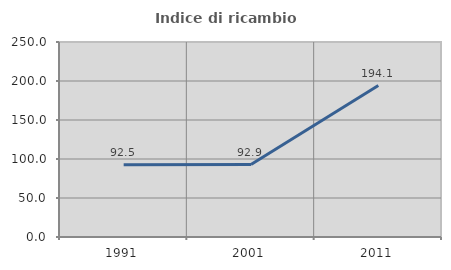
| Category | Indice di ricambio occupazionale  |
|---|---|
| 1991.0 | 92.5 |
| 2001.0 | 92.857 |
| 2011.0 | 194.118 |